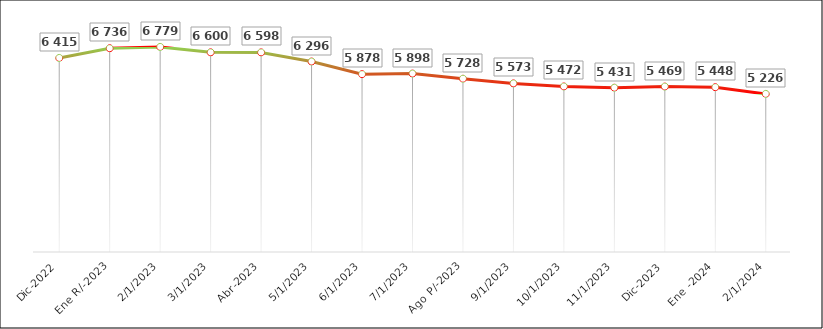
| Category | Índice  |
|---|---|
| Dic-2022 | 6415 |
| Ene R/-2023 | 6736 |
| Feb-2023 | 6779 |
| Mar-2023 | 6600 |
| Abr-2023 | 6598 |
| May-2023 | 6296 |
| Jun-2023 | 5878 |
| Jul-2023 | 5898 |
| Ago P/-2023 | 5728 |
| Sep-2023 | 5573 |
| Oct-2023 | 5472 |
| Nov-2023 | 5431 |
| Dic-2023 | 5469 |
| Ene -2024 | 5448 |
| Feb-2024 | 5226 |